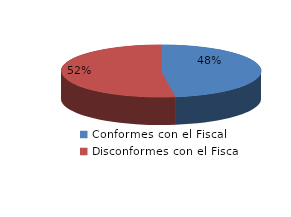
| Category | Series 0 |
|---|---|
| 0 | 760 |
| 1 | 834 |